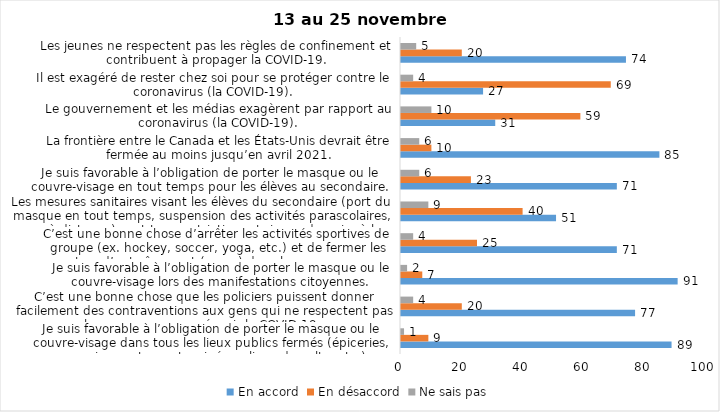
| Category | En accord | En désaccord | Ne sais pas |
|---|---|---|---|
| Je suis favorable à l’obligation de porter le masque ou le couvre-visage dans tous les lieux publics fermés (épiceries, magasins, restaurants, cinéma, lieux de culte, etc.). | 89 | 9 | 1 |
| C’est une bonne chose que les policiers puissent donner facilement des contraventions aux gens qui ne respectent pas les mesures pour prévenir la COVID-19. | 77 | 20 | 4 |
| Je suis favorable à l’obligation de porter le masque ou le couvre-visage lors des manifestations citoyennes. | 91 | 7 | 2 |
| C’est une bonne chose d’arrêter les activités sportives de groupe (ex. hockey, soccer, yoga, etc.) et de fermer les centres d’entraînement (gyms) dans les zones rouges. | 71 | 25 | 4 |
| Les mesures sanitaires visant les élèves du secondaire (port du masque en tout temps, suspension des activités parascolaires, cours à distance) sont trop restrictives et risque de nuire à leur santé mentale et leur développement. | 51 | 40 | 9 |
| Je suis favorable à l’obligation de porter le masque ou le couvre-visage en tout temps pour les élèves au secondaire. | 71 | 23 | 6 |
| La frontière entre le Canada et les États-Unis devrait être fermée au moins jusqu’en avril 2021. | 85 | 10 | 6 |
| Le gouvernement et les médias exagèrent par rapport au coronavirus (la COVID-19). | 31 | 59 | 10 |
| Il est exagéré de rester chez soi pour se protéger contre le coronavirus (la COVID-19). | 27 | 69 | 4 |
| Les jeunes ne respectent pas les règles de confinement et contribuent à propager la COVID-19. | 74 | 20 | 5 |